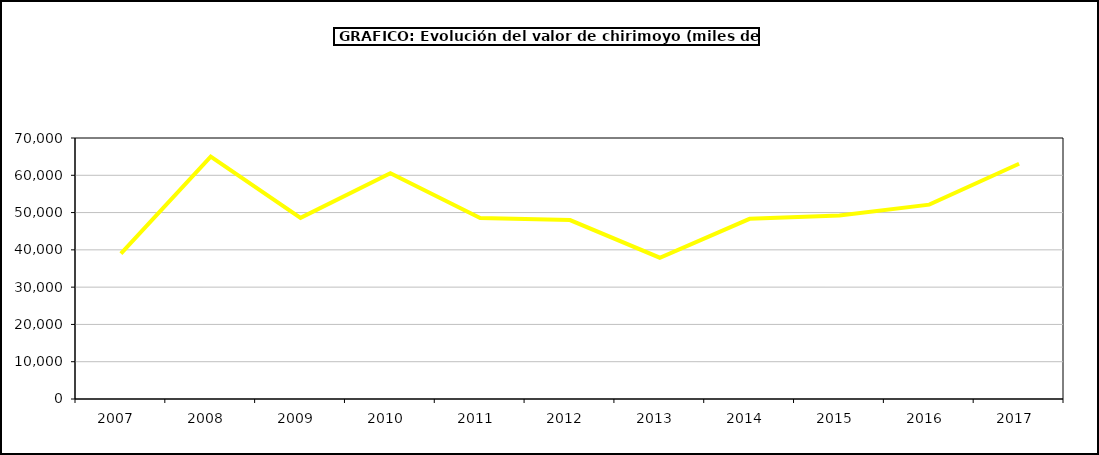
| Category | valor chirimoyo |
|---|---|
| 2007.0 | 38969.891 |
| 2008.0 | 65026.967 |
| 2009.0 | 48581.198 |
| 2010.0 | 60575.574 |
| 2011.0 | 48545.2 |
| 2012.0 | 47992.004 |
| 2013.0 | 37891.803 |
| 2014.0 | 48319.818 |
| 2015.0 | 49187 |
| 2016.0 | 52120 |
| 2017.0 | 63081.583 |